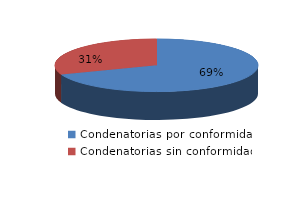
| Category | Series 0 |
|---|---|
| 0 | 1270 |
| 1 | 562 |